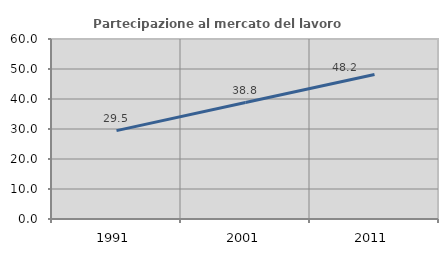
| Category | Partecipazione al mercato del lavoro  femminile |
|---|---|
| 1991.0 | 29.464 |
| 2001.0 | 38.824 |
| 2011.0 | 48.188 |